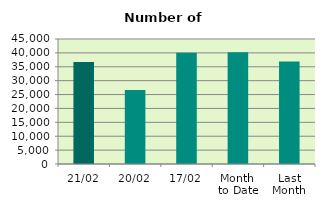
| Category | Series 0 |
|---|---|
| 21/02 | 36698 |
| 20/02 | 26622 |
| 17/02 | 40010 |
| Month 
to Date | 40271.867 |
| Last
Month | 36886.364 |